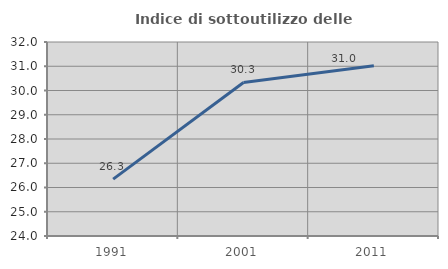
| Category | Indice di sottoutilizzo delle abitazioni  |
|---|---|
| 1991.0 | 26.346 |
| 2001.0 | 30.33 |
| 2011.0 | 31.02 |